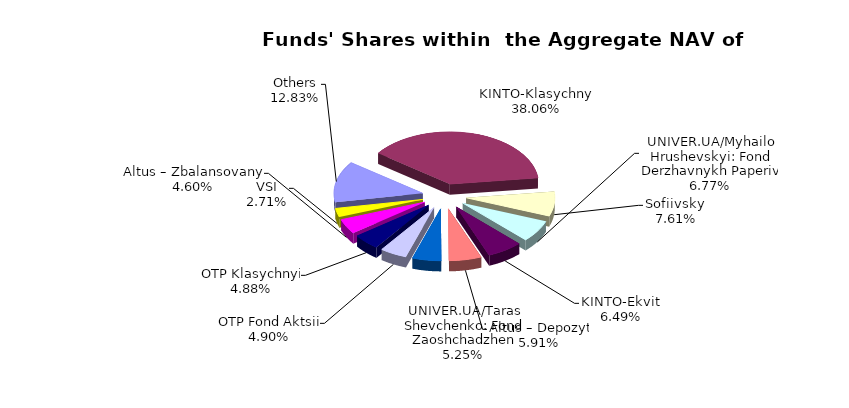
| Category | Series 0 | Series 1 |
|---|---|---|
| Others | 7866069.74 | 0.128 |
| KINTO-Klasychnyi | 23337235.8 | 0.381 |
| Sofiivskyi | 4666416.56 | 0.076 |
| UNIVER.UA/Myhailo Hrushevskyi: Fond Derzhavnykh Paperiv | 4154329.83 | 0.068 |
| KINTO-Ekviti | 3980320.31 | 0.065 |
| Altus – Depozyt | 3625627.65 | 0.059 |
| UNIVER.UA/Taras Shevchenko: Fond Zaoshchadzhen | 3217345.15 | 0.052 |
| OTP Fond Aktsii | 3002139.59 | 0.049 |
| ОТP Klasychnyi | 2990110.06 | 0.049 |
| Altus – Zbalansovanyi | 2823283.26 | 0.046 |
| VSI | 1661724.17 | 0.027 |